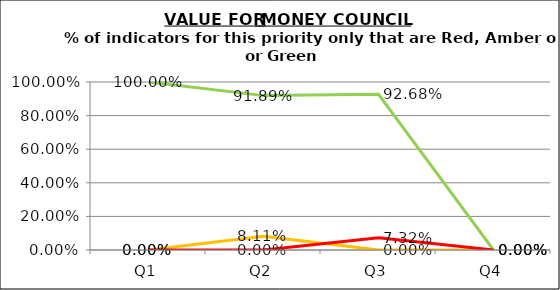
| Category | Green | Amber | Red |
|---|---|---|---|
| Q1 | 1 | 0 | 0 |
| Q2 | 0.919 | 0.081 | 0 |
| Q3 | 0.927 | 0 | 0.073 |
| Q4 | 0 | 0 | 0 |